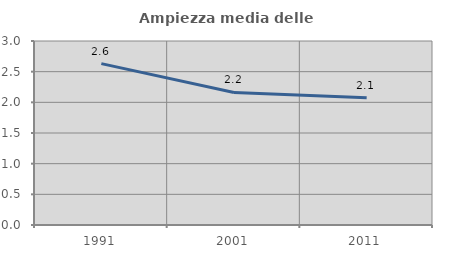
| Category | Ampiezza media delle famiglie |
|---|---|
| 1991.0 | 2.632 |
| 2001.0 | 2.161 |
| 2011.0 | 2.077 |